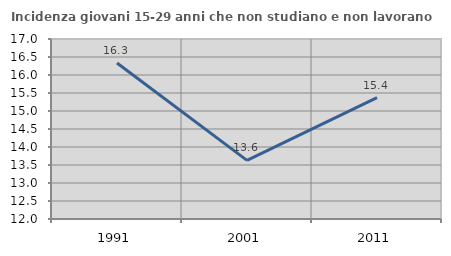
| Category | Incidenza giovani 15-29 anni che non studiano e non lavorano  |
|---|---|
| 1991.0 | 16.331 |
| 2001.0 | 13.629 |
| 2011.0 | 15.371 |